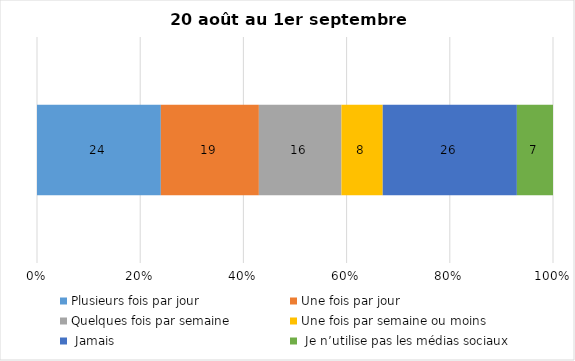
| Category | Plusieurs fois par jour | Une fois par jour | Quelques fois par semaine   | Une fois par semaine ou moins   |  Jamais   |  Je n’utilise pas les médias sociaux |
|---|---|---|---|---|---|---|
| 0 | 24 | 19 | 16 | 8 | 26 | 7 |